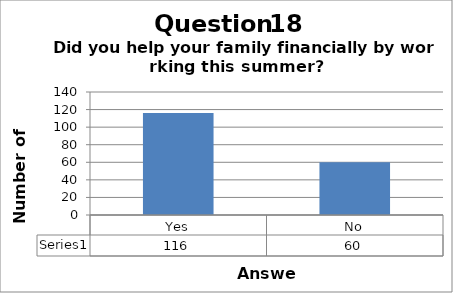
| Category | Series 0 |
|---|---|
| Yes | 116 |
| No | 60 |